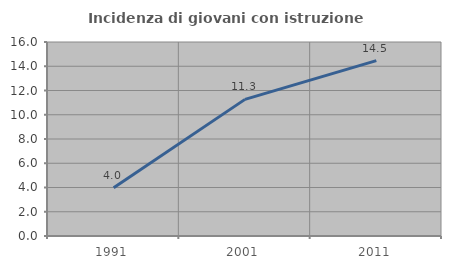
| Category | Incidenza di giovani con istruzione universitaria |
|---|---|
| 1991.0 | 3.981 |
| 2001.0 | 11.268 |
| 2011.0 | 14.465 |